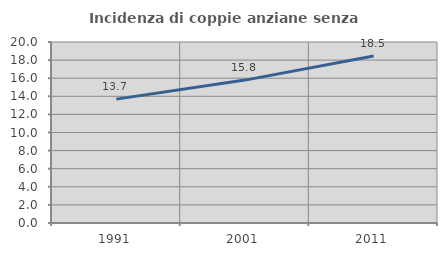
| Category | Incidenza di coppie anziane senza figli  |
|---|---|
| 1991.0 | 13.689 |
| 2001.0 | 15.789 |
| 2011.0 | 18.459 |